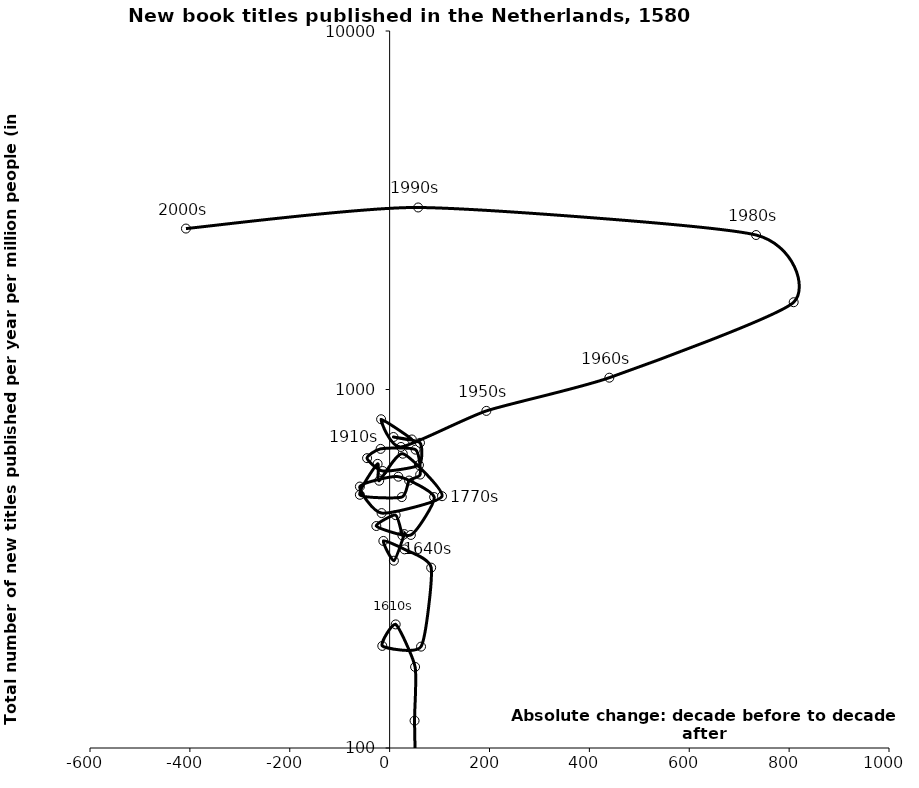
| Category | Series 0 |
|---|---|
| 8.215331015842928 | 41.269 |
| -7.612008674241805 | 49.484 |
| -18.384539426335195 | 26.045 |
| -9.34452897657706 | 12.715 |
| -0.5355602856094146 | 7.356 |
| 4.951572334851407 | 11.644 |
| 3.0718090230353843 | 17.259 |
| 25.60534548022869 | 17.787 |
| 50.68851310429157 | 68.469 |
| 49.926981764456585 | 119.164 |
| 51.00143049853887 | 168.323 |
| 12.170024486541053 | 221.167 |
| -14.694289055092455 | 192.663 |
| 62.892264333642885 | 191.779 |
| 83.18129447402843 | 318.448 |
| 29.801294008659482 | 358.141 |
| -12.56758039411477 | 378.051 |
| 8.544940026045595 | 333.006 |
| 29.429736669743193 | 395.14 |
| 25.505553663411263 | 391.866 |
| 12.10796838219946 | 446.152 |
| -26.620361007719254 | 416.082 |
| 42.54544323578415 | 392.911 |
| 89.15089321551747 | 501.172 |
| 17.482007782505292 | 571.213 |
| -59.52835073603427 | 536.137 |
| -16.076043502916747 | 452.156 |
| 104.96324523881873 | 503.984 |
| 26.327221806426365 | 662.082 |
| -20.916303054577554 | 556.639 |
| -24.05804879756917 | 620.25 |
| -59.58816625903353 | 508.523 |
| 24.35983382949118 | 501.073 |
| 39.01579015710416 | 557.242 |
| 61.14683349660106 | 579.105 |
| 51.894460277387566 | 679.536 |
| -18.061435921321674 | 682.894 |
| -45.16604679995635 | 643.413 |
| -13.966318140293822 | 592.562 |
| 58.748891857053025 | 615.481 |
| 60.7995468452109 | 710.06 |
| 7.706299864026505 | 737.08 |
| 44.50793448136062 | 725.472 |
| -17.047445763310805 | 826.096 |
| 22.752955654909613 | 691.377 |
| 193.73307332061506 | 871.601 |
| 439.9824019763946 | 1078.844 |
| 809.1190969637436 | 1751.566 |
| 733.8443816428479 | 2697.082 |
| 57.15335347310406 | 3219.255 |
| -407.8665873885607 | 2811.388 |